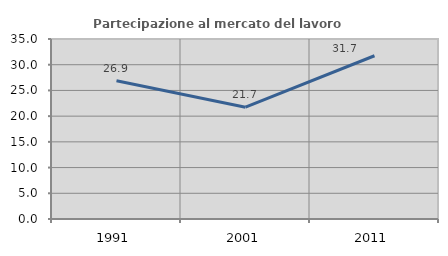
| Category | Partecipazione al mercato del lavoro  femminile |
|---|---|
| 1991.0 | 26.882 |
| 2001.0 | 21.739 |
| 2011.0 | 31.746 |